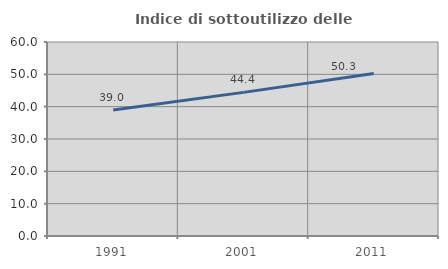
| Category | Indice di sottoutilizzo delle abitazioni  |
|---|---|
| 1991.0 | 38.996 |
| 2001.0 | 44.423 |
| 2011.0 | 50.288 |